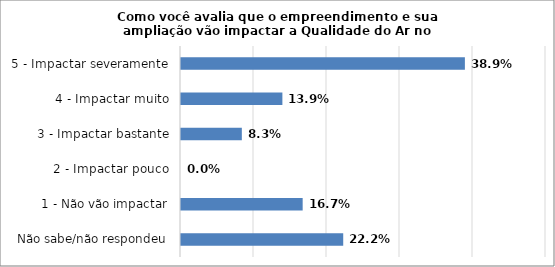
| Category | Series 0 |
|---|---|
| Não sabe/não respondeu | 0.222 |
| 1 - Não vão impactar | 0.167 |
| 2 - Impactar pouco | 0 |
| 3 - Impactar bastante | 0.083 |
| 4 - Impactar muito | 0.139 |
| 5 - Impactar severamente | 0.389 |